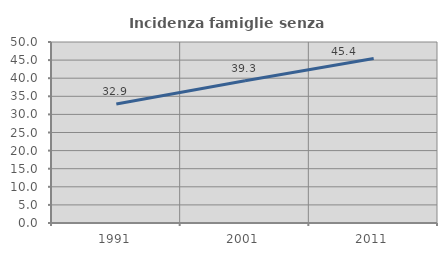
| Category | Incidenza famiglie senza nuclei |
|---|---|
| 1991.0 | 32.898 |
| 2001.0 | 39.27 |
| 2011.0 | 45.418 |